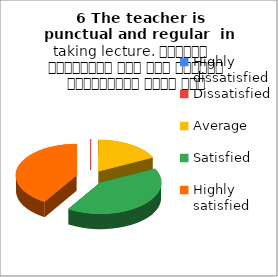
| Category | 6 The teacher is punctual and regular  in taking lecture. शिक्षक समयनिष्ठ हैं एवं नियमित व्याख्यान देते हैं |
|---|---|
| Highly dissatisfied | 0 |
| Dissatisfied | 0 |
| Average | 3 |
| Satisfied | 7 |
| Highly satisfied | 7 |